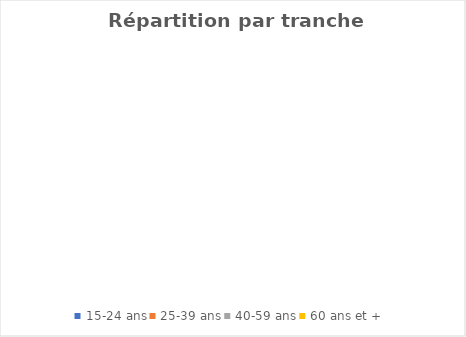
| Category | Series 0 |
|---|---|
| 15-24 ans | 0 |
| 25-39 ans | 0 |
| 40-59 ans | 0 |
| 60 ans et + | 0 |